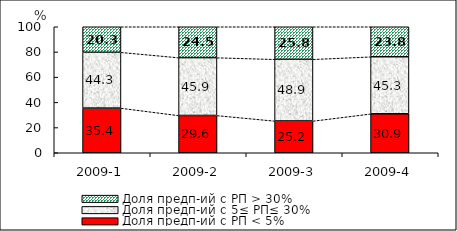
| Category | Доля предп-ий с РП < 5% | Доля предп-ий с 5≤ РП≤ 30% | Доля предп-ий с РП > 30% |
|---|---|---|---|
| 2009-1 | 35.443 | 44.297 | 20.26 |
| 2009-2 | 29.594 | 45.905 | 24.501 |
| 2009-3 | 25.241 | 48.948 | 25.811 |
| 2009-4 | 30.913 | 45.291 | 23.796 |